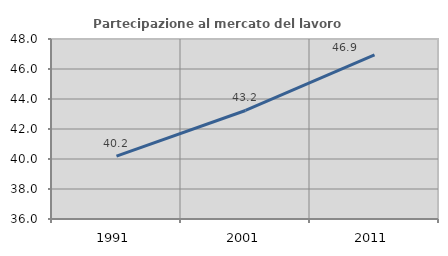
| Category | Partecipazione al mercato del lavoro  femminile |
|---|---|
| 1991.0 | 40.19 |
| 2001.0 | 43.234 |
| 2011.0 | 46.935 |